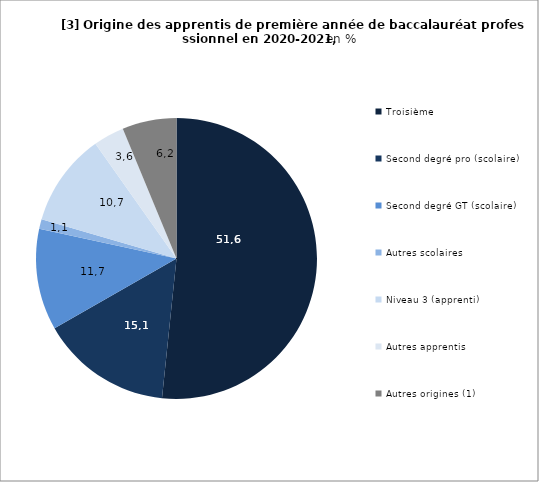
| Category | Series 0 |
|---|---|
| Troisième | 51.649 |
| Second degré pro (scolaire) | 15.081 |
| Second degré GT (scolaire) | 11.662 |
| Autres scolaires | 1.106 |
| Niveau 3 (apprenti) | 10.71 |
| Autres apprentis | 3.552 |
| Autres origines (1) | 6.24 |